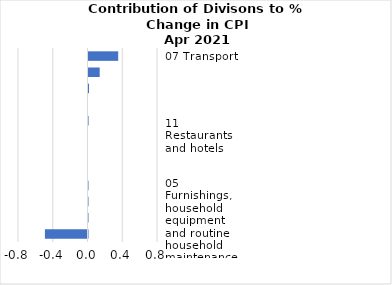
| Category |     Contributions |
|---|---|
| 07 Transport | 0.342 |
| 04 Housing, water, electricity, gas and other fuels | 0.129 |
| 12 Miscellaneous goods and services | 0.006 |
| 08 Communication | 0 |
| 03 Clothing and footwear | 0.001 |
| 11 Restaurants and hotels | 0 |
| 10 Education | 0 |
| 09 Recreation and culture | 0 |
| 06 Health | -0.003 |
| 02 Alcoholic beverages, tobacco and narcotics | -0.004 |
| 05 Furnishings, household equipment and routine household maintenance | -0.006 |
| 01 Food and non-alcoholic beverages | -0.49 |